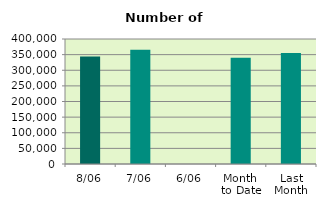
| Category | Series 0 |
|---|---|
| 8/06 | 344178 |
| 7/06 | 365272 |
| 6/06 | 0 |
| Month 
to Date | 339863.2 |
| Last
Month | 355289.273 |